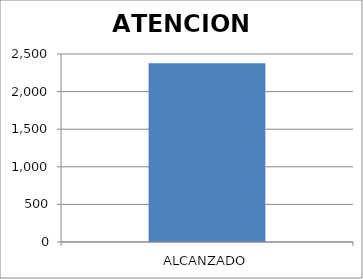
| Category | ATENCION BRINDADA |
|---|---|
| ALCANZADO | 2376 |